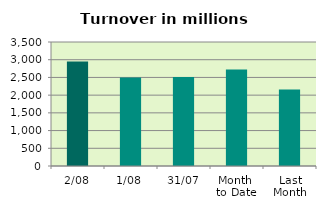
| Category | Series 0 |
|---|---|
| 2/08 | 2948.499 |
| 1/08 | 2498.126 |
| 31/07 | 2512.728 |
| Month 
to Date | 2723.313 |
| Last
Month | 2159.874 |